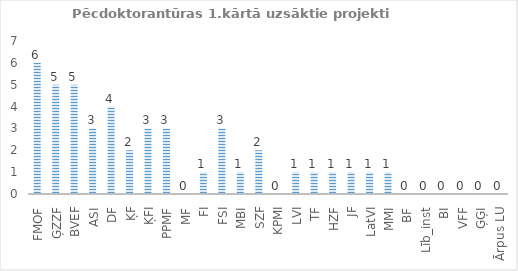
| Category | Series 0 |
|---|---|
| FMOF | 6 |
| ĢZZF | 5 |
| BVEF | 5 |
| ASI | 3 |
| DF | 4 |
| ĶF | 2 |
| ĶFI | 3 |
| PPMF | 3 |
| MF | 0 |
| FI | 1 |
| FSI | 3 |
| MBI | 1 |
| SZF | 2 |
| KPMI | 0 |
| LVI | 1 |
| TF | 1 |
| HZF | 1 |
| JF | 1 |
| LatVI | 1 |
| MMI | 1 |
| BF | 0 |
| Līb_inst | 0 |
| BI | 0 |
| VFF | 0 |
| ĢĢI | 0 |
| Ārpus LU | 0 |